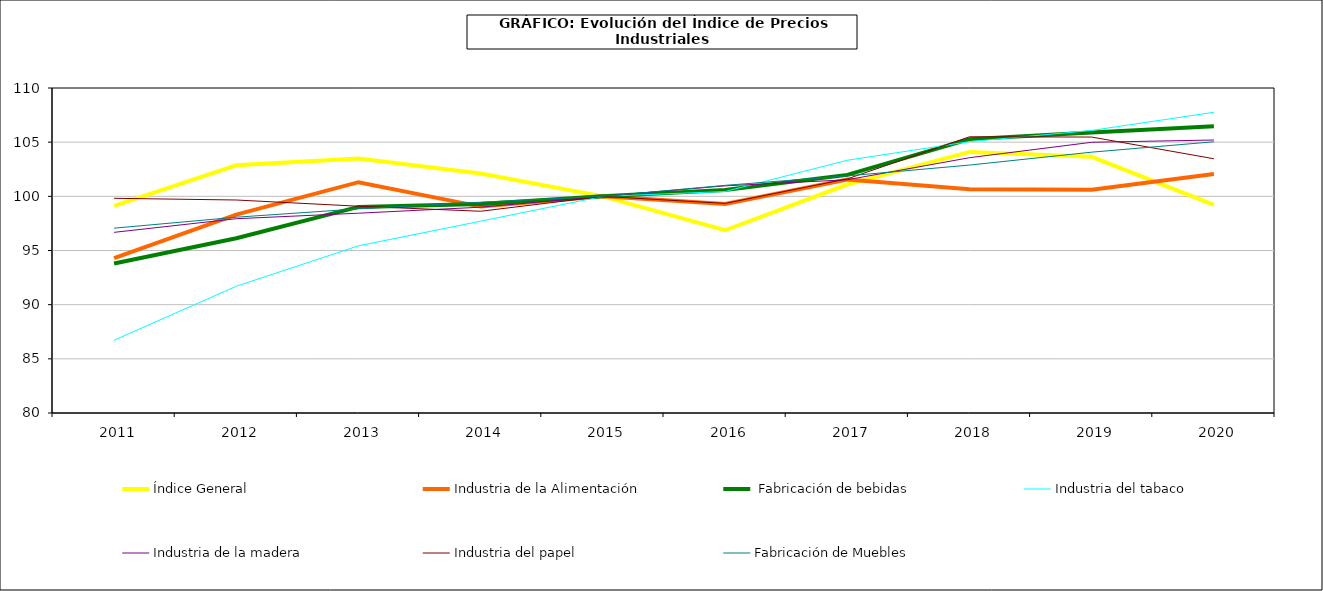
| Category | Índice General | Industria de la Alimentación |  Fabricación de bebidas | Industria del tabaco | Industria de la madera  | Industria del papel | Fabricación de Muebles |
|---|---|---|---|---|---|---|---|
|    2011 | 99.126 | 94.287 | 93.8 | 86.719 | 96.675 | 99.819 | 97.061 |
|    2012 | 102.869 | 98.31 | 96.137 | 91.704 | 97.934 | 99.661 | 98.074 |
|    2013 | 103.496 | 101.306 | 99.026 | 95.432 | 98.444 | 99.086 | 98.846 |
|    2014 | 102.112 | 99.053 | 99.281 | 97.706 | 98.997 | 98.623 | 99.459 |
|    2015 | 100 | 100 | 100 | 100 | 100 | 100 | 100 |
|    2016 | 96.869 | 99.296 | 100.581 | 100.444 | 100.967 | 99.346 | 101.015 |
|    2017 | 101.09 | 101.557 | 101.982 | 103.33 | 101.53 | 101.611 | 101.884 |
|    2018 | 104.1 | 100.647 | 105.281 | 105.049 | 103.567 | 105.498 | 102.886 |
|    2019 | 103.645 | 100.612 | 105.889 | 106.081 | 104.991 | 105.472 | 104.077 |
|    2020 | 99.202 | 102.059 | 106.476 | 107.759 | 105.199 | 103.468 | 105.038 |